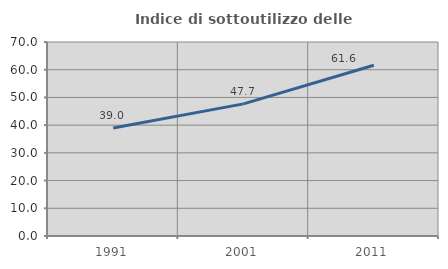
| Category | Indice di sottoutilizzo delle abitazioni  |
|---|---|
| 1991.0 | 38.973 |
| 2001.0 | 47.678 |
| 2011.0 | 61.613 |